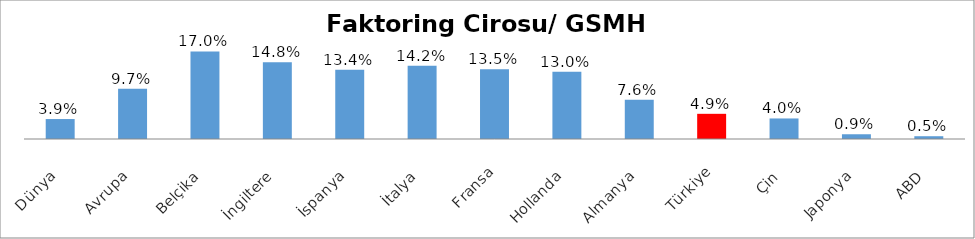
| Category | Faktoring Cirosu/ GSMH (%) |
|---|---|
| Dünya | 0.039 |
| Avrupa | 0.097 |
| Belçika | 0.17 |
| İngiltere | 0.148 |
| İspanya | 0.134 |
| İtalya | 0.142 |
| Fransa | 0.135 |
| Hollanda | 0.13 |
| Almanya | 0.076 |
| Türkiye | 0.049 |
| Çin | 0.04 |
| Japonya | 0.009 |
| ABD | 0.005 |